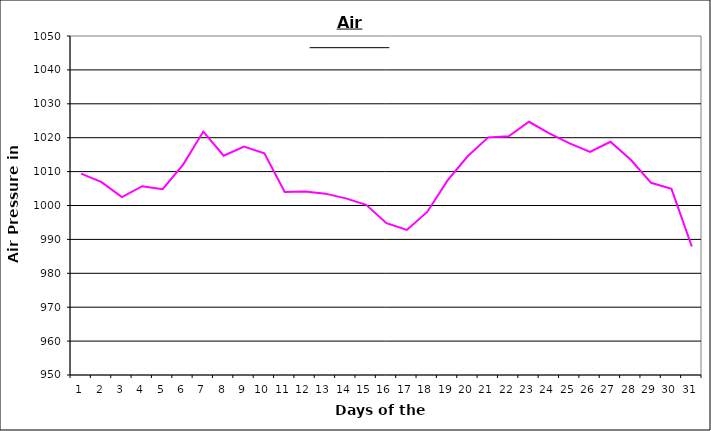
| Category | Series 0 |
|---|---|
| 0 | 1009.4 |
| 1 | 1006.9 |
| 2 | 1002.5 |
| 3 | 1005.7 |
| 4 | 1004.8 |
| 5 | 1012 |
| 6 | 1021.8 |
| 7 | 1014.7 |
| 8 | 1017.4 |
| 9 | 1015.4 |
| 10 | 1004 |
| 11 | 1004.1 |
| 12 | 1003.5 |
| 13 | 1002.1 |
| 14 | 1000.2 |
| 15 | 994.8 |
| 16 | 992.8 |
| 17 | 998.1 |
| 18 | 1007.4 |
| 19 | 1014.6 |
| 20 | 1020.1 |
| 21 | 1020.4 |
| 22 | 1024.7 |
| 23 | 1021.3 |
| 24 | 1018.3 |
| 25 | 1015.8 |
| 26 | 1018.8 |
| 27 | 1013.5 |
| 28 | 1006.7 |
| 29 | 1004.9 |
| 30 | 987.9 |